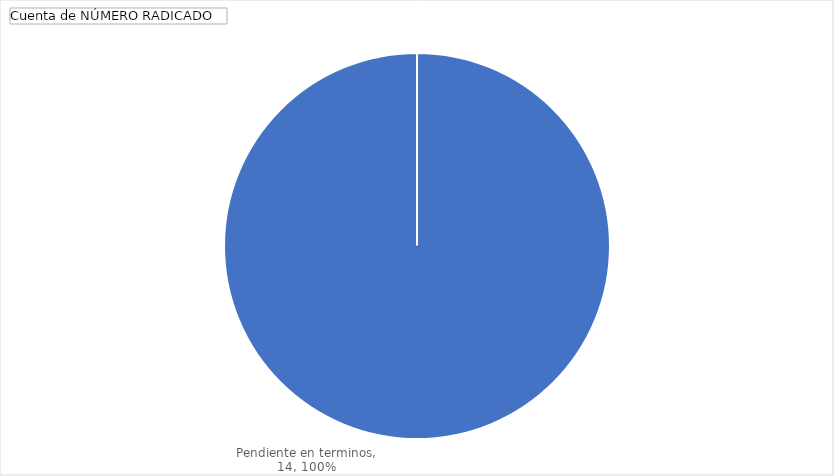
| Category | Total |
|---|---|
| Pendiente en terminos | 14 |